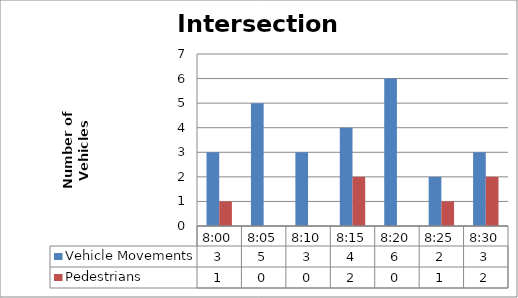
| Category | Vehicle Movements | Pedestrians |
|---|---|---|
| 0.3333333333333333 | 3 | 1 |
| 0.3368055555555556 | 5 | 0 |
| 0.34027777777777773 | 3 | 0 |
| 0.34375 | 4 | 2 |
| 0.347222222222222 | 6 | 0 |
| 0.350694444444445 | 2 | 1 |
| 0.354166666666667 | 3 | 2 |